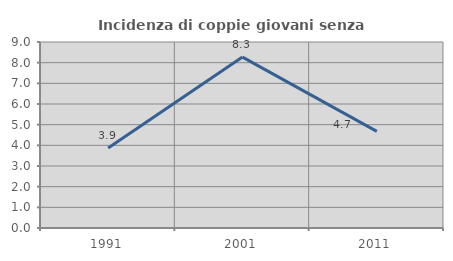
| Category | Incidenza di coppie giovani senza figli |
|---|---|
| 1991.0 | 3.876 |
| 2001.0 | 8.27 |
| 2011.0 | 4.677 |